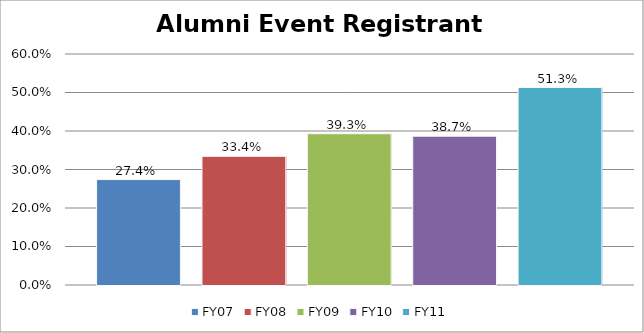
| Category | FY07 | FY08 | FY09 | FY10 | FY11 |
|---|---|---|---|---|---|
| 0 | 0.274 | 0.334 | 0.393 | 0.387 | 0.513 |